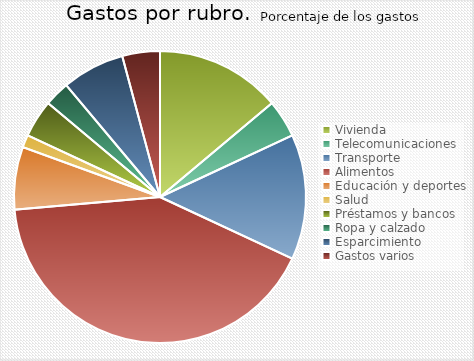
| Category | Series 0 |
|---|---|
| Vivienda | 10000 |
| Telecomunicaciones | 3000 |
| Transporte  | 10000 |
| Alimentos | 30000 |
| Educación y deportes | 5000 |
| Salud | 1000 |
| Préstamos y bancos | 3000 |
| Ropa y calzado | 2000 |
| Esparcimiento  | 5000 |
| Gastos varios | 3000 |